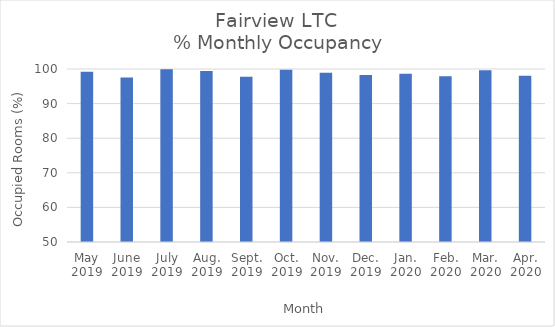
| Category | % Monthly Occupancy |
|---|---|
| May
2019 | 99.23 |
| June
2019 | 97.54 |
| July
2019 | 99.96 |
| Aug.
2019 | 99.39 |
| Sept.
2019 | 97.74 |
| Oct.
2019 | 99.77 |
| Nov.
2019 | 98.89 |
| Dec.
2019 | 98.27 |
| Jan.
2020 | 98.66 |
| Feb.
2020 | 97.87 |
| Mar.
2020 | 99.65 |
| Apr.
2020 | 98.06 |